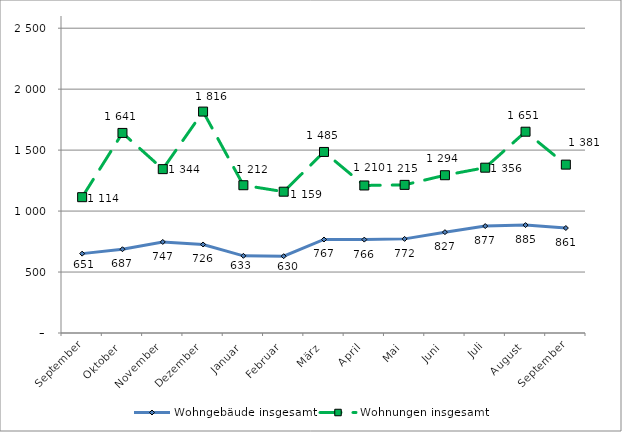
| Category | Wohngebäude insgesamt | Wohnungen insgesamt |
|---|---|---|
| September | 651 | 1114 |
| Oktober | 687 | 1641 |
| November | 747 | 1344 |
| Dezember | 726 | 1816 |
| Januar | 633 | 1212 |
| Februar | 630 | 1159 |
| März | 767 | 1485 |
| April | 766 | 1210 |
| Mai | 772 | 1215 |
| Juni | 827 | 1294 |
| Juli | 877 | 1356 |
| August | 885 | 1651 |
| September | 861 | 1381 |